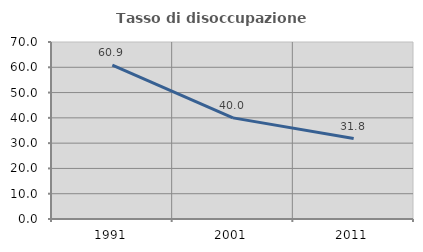
| Category | Tasso di disoccupazione giovanile  |
|---|---|
| 1991.0 | 60.87 |
| 2001.0 | 40 |
| 2011.0 | 31.818 |